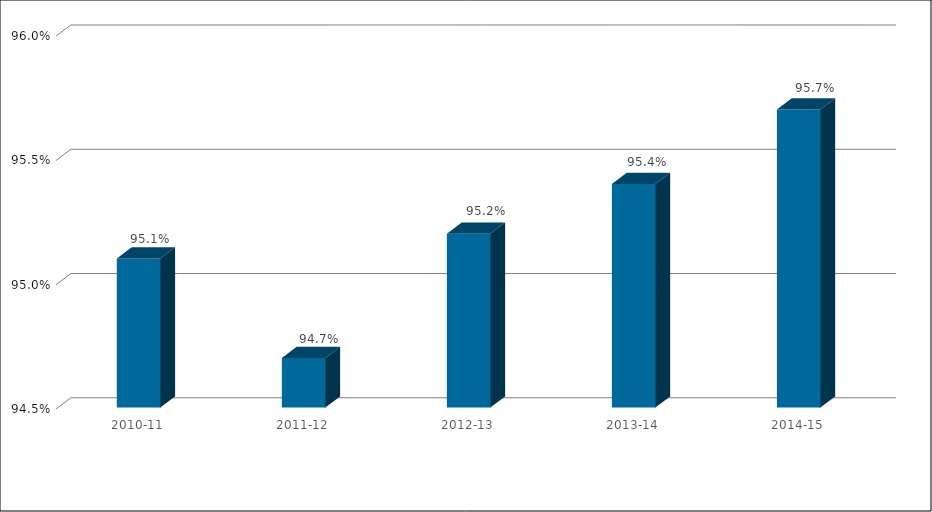
| Category | Series 0 |
|---|---|
| 2010-11 | 0.951 |
| 2011-12 | 0.947 |
| 2012-13 | 0.952 |
| 2013-14 | 0.954 |
| 2014-15 | 0.957 |